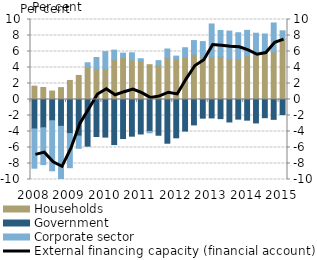
| Category | Households | Government | Corporate sector |
|---|---|---|---|
| 2008.0 | 1.667 | -3.681 | -4.907 |
| 2008.0 | 1.498 | -3.534 | -4.607 |
| 2008.0 | 1.055 | -2.654 | -6.26 |
| 2008.0 | 1.484 | -3.352 | -6.548 |
| 2009.0 | 2.381 | -4.26 | -4.266 |
| 2009.0 | 3.007 | -4.572 | -1.528 |
| 2009.0 | 3.999 | -5.832 | 0.59 |
| 2009.0 | 3.816 | -4.628 | 1.431 |
| 2010.0 | 3.85 | -4.7 | 2.133 |
| 2010.0 | 4.974 | -5.635 | 1.197 |
| 2010.0 | 5.235 | -4.88 | 0.559 |
| 2010.0 | 4.955 | -4.585 | 0.88 |
| 2011.0 | 4.83 | -4.31 | 0.265 |
| 2011.0 | 4.35 | -3.993 | -0.177 |
| 2011.0 | 4.26 | -4.467 | 0.596 |
| 2011.0 | 5.201 | -5.465 | 1.111 |
| 2012.0 | 5.065 | -4.789 | 0.359 |
| 2012.0 | 5.265 | -3.948 | 1.206 |
| 2012.0 | 5.638 | -3.177 | 1.729 |
| 2012.0 | 5.213 | -2.33 | 2.024 |
| 2013.0 | 5.33 | -2.302 | 4.112 |
| 2013.0 | 5.384 | -2.394 | 3.242 |
| 2013.0 | 5.046 | -2.81 | 3.505 |
| 2013.0 | 5.027 | -2.453 | 3.315 |
| 2014.0 | 5.464 | -2.583 | 3.179 |
| 2014.0 | 5.635 | -2.93 | 2.649 |
| 2014.0 | 5.924 | -2.274 | 2.264 |
| 2014.0 | 5.946 | -2.482 | 3.62 |
| 2015.0 | 7.507 | -1.889 | 1.079 |